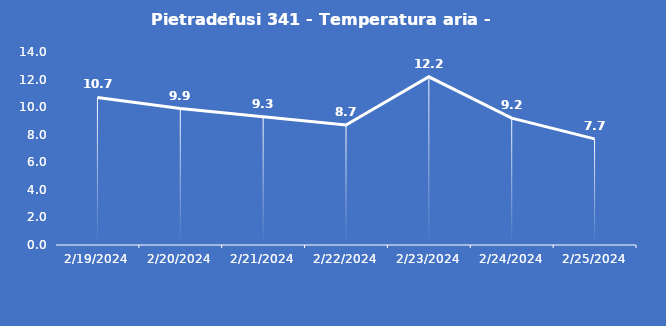
| Category | Pietradefusi 341 - Temperatura aria - Grezzo (°C) |
|---|---|
| 2/19/24 | 10.7 |
| 2/20/24 | 9.9 |
| 2/21/24 | 9.3 |
| 2/22/24 | 8.7 |
| 2/23/24 | 12.2 |
| 2/24/24 | 9.2 |
| 2/25/24 | 7.7 |